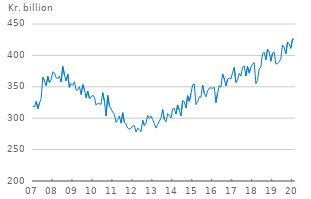
| Category | Total deposits  (ultimo) |
|---|---|
| 2007-01-01 | 318.869 |
| 2007-02-01 | 318.106 |
| 2007-03-01 | 326.875 |
| 2007-04-01 | 315.142 |
| 2007-05-01 | 324.087 |
| 2007-06-01 | 331.032 |
| 2007-07-01 | 365.399 |
| 2007-08-01 | 359.408 |
| 2007-09-01 | 351.937 |
| 2007-10-01 | 366.509 |
| 2007-11-01 | 356.743 |
| 2007-12-01 | 361.203 |
| 2008-01-01 | 373.939 |
| 2008-02-01 | 371.935 |
| 2008-03-01 | 364.535 |
| 2008-04-01 | 363.215 |
| 2008-05-01 | 366.827 |
| 2008-06-01 | 357.644 |
| 2008-07-01 | 382.572 |
| 2008-08-01 | 368.83 |
| 2008-09-01 | 359.149 |
| 2008-10-01 | 370.134 |
| 2008-11-01 | 348.932 |
| 2008-12-01 | 355.166 |
| 2009-01-01 | 352.395 |
| 2009-02-01 | 358.036 |
| 2009-03-01 | 344.539 |
| 2009-04-01 | 345.266 |
| 2009-05-01 | 350.119 |
| 2009-06-01 | 337.687 |
| 2009-07-01 | 353.606 |
| 2009-08-01 | 345.645 |
| 2009-09-01 | 332.212 |
| 2009-10-01 | 343.339 |
| 2009-11-01 | 331.743 |
| 2009-12-01 | 333.158 |
| 2010-01-01 | 336.747 |
| 2010-02-01 | 333.162 |
| 2010-03-01 | 320.833 |
| 2010-04-01 | 323.328 |
| 2010-05-01 | 322.957 |
| 2010-06-01 | 322.281 |
| 2010-07-01 | 340.62 |
| 2010-08-01 | 327.161 |
| 2010-09-01 | 303.662 |
| 2010-10-01 | 336.281 |
| 2010-11-01 | 319.821 |
| 2010-12-01 | 314.677 |
| 2011-01-01 | 309.659 |
| 2011-02-01 | 306.043 |
| 2011-03-01 | 293.336 |
| 2011-04-01 | 297.504 |
| 2011-05-01 | 303.548 |
| 2011-06-01 | 292.07 |
| 2011-07-01 | 308.692 |
| 2011-08-01 | 293.302 |
| 2011-09-01 | 290.211 |
| 2011-10-01 | 284.138 |
| 2011-11-01 | 282.592 |
| 2011-12-01 | 284.193 |
| 2012-01-01 | 287.865 |
| 2012-02-01 | 288.116 |
| 2012-03-01 | 277.977 |
| 2012-04-01 | 283.992 |
| 2012-05-01 | 281.91 |
| 2012-06-01 | 278.704 |
| 2012-07-01 | 296.82 |
| 2012-08-01 | 288.409 |
| 2012-09-01 | 292.351 |
| 2012-10-01 | 304.565 |
| 2012-11-01 | 299.586 |
| 2012-12-01 | 303.41 |
| 2013-01-01 | 297.812 |
| 2013-02-01 | 290.961 |
| 2013-03-01 | 284.229 |
| 2013-04-01 | 289.884 |
| 2013-05-01 | 295.437 |
| 2013-06-01 | 300.506 |
| 2013-07-01 | 313.846 |
| 2013-08-01 | 297.81 |
| 2013-09-01 | 294.25 |
| 2013-10-01 | 307.344 |
| 2013-11-01 | 304.548 |
| 2013-12-01 | 300.408 |
| 2014-01-01 | 314.855 |
| 2014-02-01 | 315.56 |
| 2014-03-01 | 306.611 |
| 2014-04-01 | 321.118 |
| 2014-05-01 | 312.641 |
| 2014-06-01 | 303.858 |
| 2014-07-01 | 327.894 |
| 2014-08-01 | 326.062 |
| 2014-09-01 | 316.271 |
| 2014-10-01 | 335.953 |
| 2014-11-01 | 326.874 |
| 2014-12-01 | 338.917 |
| 2015-01-01 | 353.207 |
| 2015-02-01 | 354.37 |
| 2015-03-01 | 321.547 |
| 2015-04-01 | 326.223 |
| 2015-05-01 | 334.182 |
| 2015-06-01 | 333.231 |
| 2015-07-01 | 352.657 |
| 2015-08-01 | 339.372 |
| 2015-09-01 | 334.054 |
| 2015-10-01 | 343.701 |
| 2015-11-01 | 347.797 |
| 2015-12-01 | 348.363 |
| 2016-01-01 | 347.575 |
| 2016-02-01 | 349.187 |
| 2016-03-01 | 324.628 |
| 2016-04-01 | 340.157 |
| 2016-05-01 | 351.824 |
| 2016-06-01 | 349.347 |
| 2016-07-01 | 370.488 |
| 2016-08-01 | 362.705 |
| 2016-09-01 | 351.308 |
| 2016-10-01 | 362.302 |
| 2016-11-01 | 363.87 |
| 2016-12-01 | 362.34 |
| 2017-01-01 | 372.757 |
| 2017-02-01 | 380.804 |
| 2017-03-01 | 357.026 |
| 2017-04-01 | 360.984 |
| 2017-05-01 | 371.286 |
| 2017-06-01 | 366.958 |
| 2017-07-01 | 381.297 |
| 2017-08-01 | 383.321 |
| 2017-09-01 | 367.151 |
| 2017-10-01 | 382.521 |
| 2017-11-01 | 371.824 |
| 2017-12-01 | 381.177 |
| 2018-01-01 | 386.536 |
| 2018-02-01 | 388.333 |
| 2018-03-01 | 355.16 |
| 2018-04-01 | 360.309 |
| 2018-05-01 | 378.726 |
| 2018-06-01 | 381.317 |
| 2018-07-01 | 403.084 |
| 2018-08-01 | 404.91 |
| 2018-09-01 | 393.005 |
| 2018-10-01 | 410.019 |
| 2018-11-01 | 405.457 |
| 2018-12-01 | 390.669 |
| 2019-01-01 | 403.785 |
| 2019-02-01 | 405.136 |
| 2019-03-01 | 386.402 |
| 2019-04-01 | 386.664 |
| 2019-05-01 | 389.875 |
| 2019-06-01 | 394.932 |
| 2019-07-01 | 416.67 |
| 2019-08-01 | 412.8 |
| 2019-09-01 | 402.54 |
| 2019-10-01 | 420.978 |
| 2019-11-01 | 418.514 |
| 2019-12-01 | 411.21 |
| 2020-01-01 | 426.206 |
| 2020-02-01 | 425.727 |